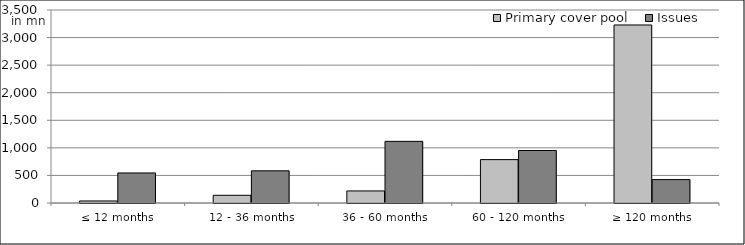
| Category | Primary cover pool | Issues |
|---|---|---|
| ≤ 12 months | 36804686.158 | 544830197.37 |
| 12 - 36 months | 140065798.111 | 583150000 |
| 36 - 60 months | 218889549.121 | 1118000000 |
| 60 - 120 months | 786839301.92 | 952000000 |
| ≥ 120 months | 3228517110.42 | 424352789.19 |